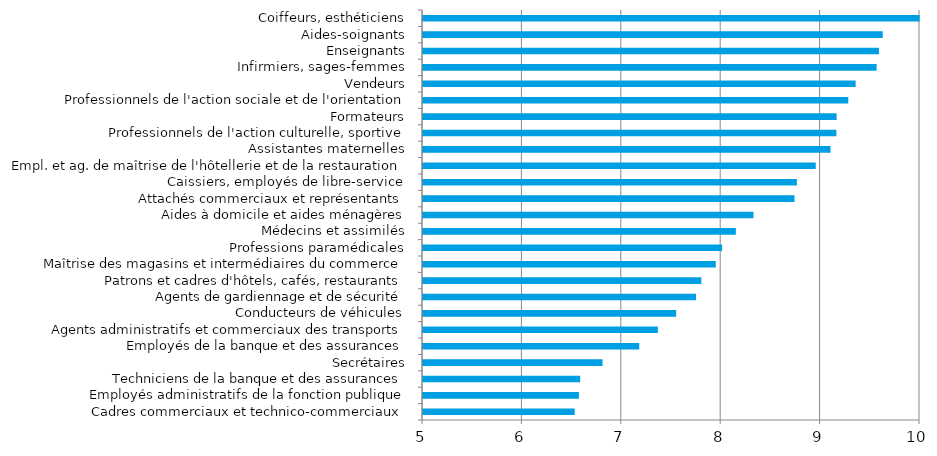
| Category | Series 0 |
|---|---|
| Cadres commerciaux et technico-commerciaux | 6.526 |
| Employés administratifs de la fonction publique | 6.568 |
| Techniciens de la banque et des assurances | 6.581 |
| Secrétaires | 6.807 |
| Employés de la banque et des assurances | 7.176 |
| Agents administratifs et commerciaux des transports | 7.363 |
| Conducteurs de véhicules | 7.547 |
| Agents de gardiennage et de sécurité | 7.746 |
| Patrons et cadres d'hôtels, cafés, restaurants | 7.8 |
| Maîtrise des magasins et intermédiaires du commerce | 7.945 |
| Professions paramédicales | 8.009 |
| Médecins et assimilés | 8.147 |
| Aides à domicile et aides ménagères | 8.325 |
| Attachés commerciaux et représentants | 8.737 |
| Caissiers, employés de libre-service | 8.761 |
| Empl. et ag. de maîtrise de l'hôtellerie et de la restauration | 8.951 |
| Assistantes maternelles | 9.1 |
| Professionnels de l'action culturelle, sportive | 9.159 |
| Formateurs | 9.161 |
| Professionnels de l'action sociale et de l'orientation | 9.279 |
| Vendeurs | 9.352 |
| Infirmiers, sages-femmes | 9.563 |
| Enseignants | 9.587 |
| Aides-soignants | 9.625 |
| Coiffeurs, esthéticiens | 9.997 |